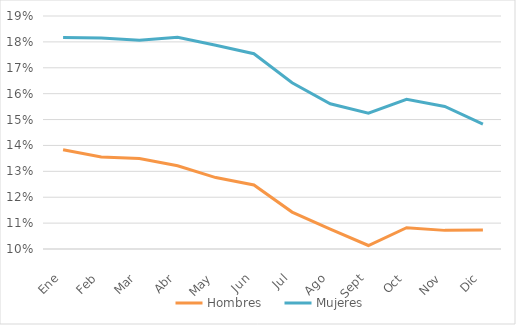
| Category | Hombres  | Mujeres |
|---|---|---|
| Ene | 0.138 | 0.182 |
| Feb | 0.136 | 0.182 |
| Mar | 0.135 | 0.181 |
| Abr | 0.132 | 0.182 |
| May | 0.128 | 0.179 |
| Jun | 0.125 | 0.175 |
| Jul | 0.114 | 0.164 |
| Ago | 0.108 | 0.156 |
| Sept | 0.101 | 0.152 |
| Oct | 0.108 | 0.158 |
| Nov | 0.107 | 0.155 |
| Dic | 0.107 | 0.148 |